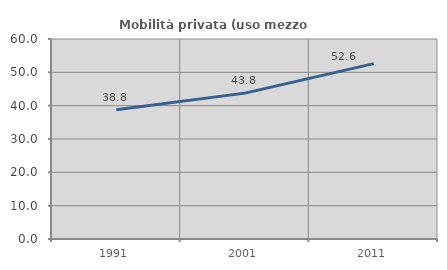
| Category | Mobilità privata (uso mezzo privato) |
|---|---|
| 1991.0 | 38.772 |
| 2001.0 | 43.761 |
| 2011.0 | 52.609 |